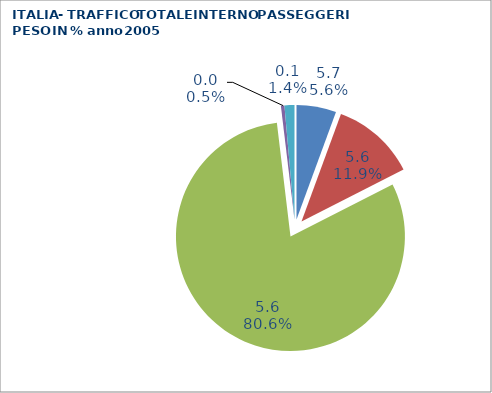
| Category | 2005 |
|---|---|
| 5.704062030854 | 5.6 |
| 5.61527741157859 | 11.9 |
| 5.565558024784361 | 80.6 |
| 0.049827004514563365 | 0.5 |
| 0.08878461927540988 | 1.4 |